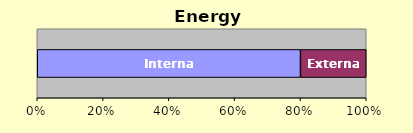
| Category | Internal | External |
|---|---|---|
| 0 | 4 | 1 |